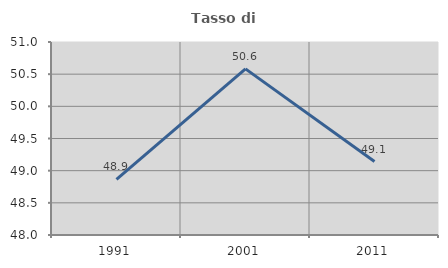
| Category | Tasso di occupazione   |
|---|---|
| 1991.0 | 48.863 |
| 2001.0 | 50.582 |
| 2011.0 | 49.141 |